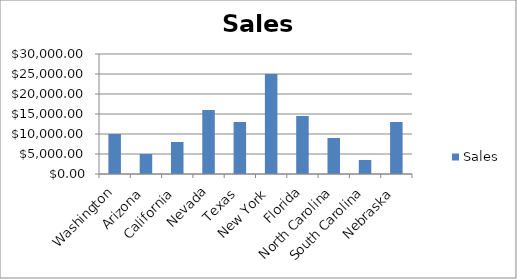
| Category | Sales |
|---|---|
| Washington | 10000 |
| Arizona | 5000 |
| California | 8000 |
| Nevada | 16000 |
| Texas | 13000 |
| New York | 25000 |
| Florida | 14500 |
| North Carolina | 9000 |
| South Carolina | 3500 |
| Nebraska | 13000 |